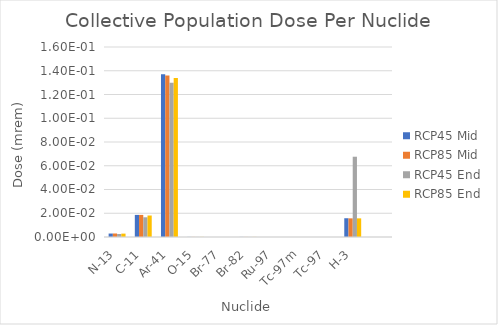
| Category | RCP45 Mid | RCP85 Mid | RCP45 End | RCP85 End |
|---|---|---|---|---|
| N-13 | 0.003 | 0.003 | 0.003 | 0.003 |
| C-11 | 0.019 | 0.019 | 0.017 | 0.018 |
| Ar-41 | 0.137 | 0.136 | 0.13 | 0.134 |
| O-15 | 0 | 0 | 0 | 0 |
| Br-77 | 0 | 0 | 0 | 0 |
| Br-82 | 0 | 0 | 0 | 0 |
| Ru-97 | 0 | 0 | 0 | 0 |
| Tc-97m | 0 | 0 | 0 | 0 |
| Tc-97 | 0 | 0 | 0 | 0 |
| H-3 | 0.016 | 0.016 | 0.068 | 0.016 |